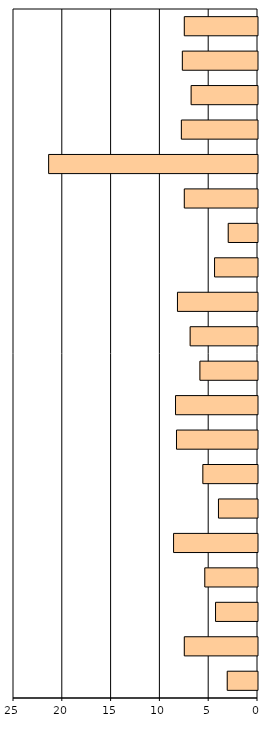
| Category | Series 0 |
|---|---|
| 0 | 3.1 |
| 1 | 7.5 |
| 2 | 4.3 |
| 3 | 5.4 |
| 4 | 8.6 |
| 5 | 4 |
| 6 | 5.6 |
| 7 | 8.3 |
| 8 | 8.4 |
| 9 | 5.9 |
| 10 | 6.9 |
| 11 | 8.2 |
| 12 | 4.4 |
| 13 | 3 |
| 14 | 7.5 |
| 15 | 21.4 |
| 16 | 7.8 |
| 17 | 6.8 |
| 18 | 7.7 |
| 19 | 7.5 |